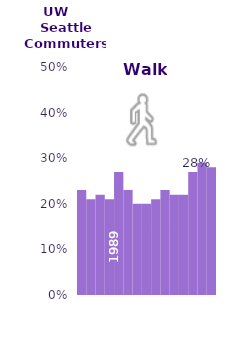
| Category | Walk |
|---|---|
| 1989.0 | 23 |
| 1992.0 | 21 |
| 1994.0 | 22 |
| 1996.0 | 21 |
| 1998.0 | 27 |
| 2000.0 | 23 |
| 2002.0 | 20 |
| 2004.0 | 20 |
| 2006.0 | 21 |
| 2008.0 | 23 |
| 2010.0 | 22 |
| 2012.0 | 22 |
| 2014.0 | 27 |
| 2015.0 | 29 |
| 2016.0 | 28 |